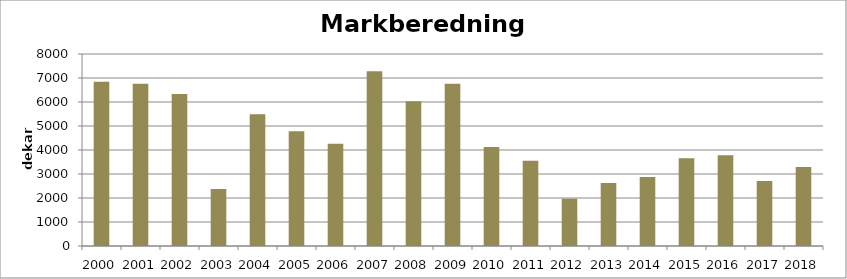
| Category | Totalt |
|---|---|
| 2000 | 6844 |
| 2001 | 6762 |
| 2002 | 6329 |
| 2003 | 2375 |
| 2004 | 5494 |
| 2005 | 4784 |
| 2006 | 4260 |
| 2007 | 7282 |
| 2008 | 6027 |
| 2009 | 6757 |
| 2010 | 4130 |
| 2011 | 3551 |
| 2012 | 1970 |
| 2013 | 2626 |
| 2014 | 2879 |
| 2015 | 3660 |
| 2016 | 3782 |
| 2017 | 2704 |
| 2018 | 3291 |